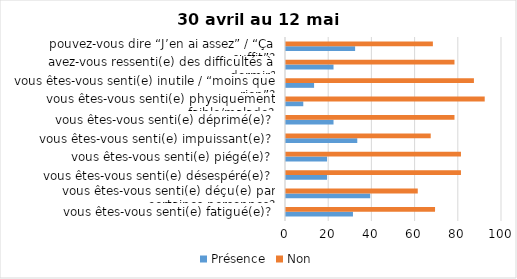
| Category | Présence | Non |
|---|---|---|
| vous êtes-vous senti(e) fatigué(e)? | 31 | 69 |
| vous êtes-vous senti(e) déçu(e) par certaines personnes? | 39 | 61 |
| vous êtes-vous senti(e) désespéré(e)? | 19 | 81 |
| vous êtes-vous senti(e) piégé(e)? | 19 | 81 |
| vous êtes-vous senti(e) impuissant(e)? | 33 | 67 |
| vous êtes-vous senti(e) déprimé(e)? | 22 | 78 |
| vous êtes-vous senti(e) physiquement faible/malade? | 8 | 92 |
| vous êtes-vous senti(e) inutile / “moins que rien”? | 13 | 87 |
| avez-vous ressenti(e) des difficultés à dormir? | 22 | 78 |
| pouvez-vous dire “J’en ai assez” / “Ça suffit”? | 32 | 68 |